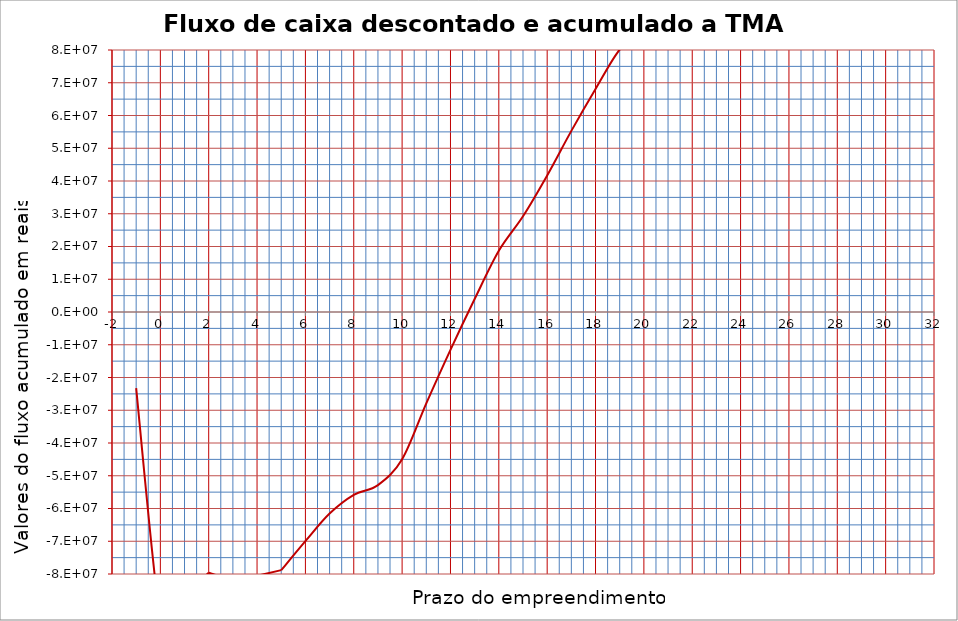
| Category | Series 0 |
|---|---|
| -1.0 | -23218272 |
| 0.0 | -93754491.2 |
| 1.0 | -85589215.376 |
| 2.0 | -79601349.001 |
| 3.0 | -82279243.617 |
| 4.0 | -88448067.035 |
| 5.0 | -78814613.334 |
| 6.0 | -69970709.663 |
| 7.0 | -61554220.201 |
| 8.0 | -55838624.352 |
| 9.0 | -52850011.091 |
| 10.0 | -44966898.924 |
| 11.0 | -27878823.883 |
| 12.0 | -11544958.816 |
| 13.0 | 3972185.262 |
| 14.0 | 18690490.239 |
| 15.0 | 29235287.189 |
| 16.0 | 41707735.493 |
| 17.0 | 55302941.022 |
| 18.0 | 68102350.947 |
| 19.0 | 80144210.777 |
| 20.0 | 86761355.165 |
| 21.0 | 93288423.862 |
| 22.0 | 103309916.146 |
| 23.0 | 112675244.242 |
| 24.0 | 121420299.528 |
| 25.0 | 129533099.619 |
| 26.0 | 137116440.456 |
| 27.0 | 144169099.245 |
| 28.0 | 150728744.156 |
| 29.0 | 156832532.384 |
| 30.0 | 162504473.621 |